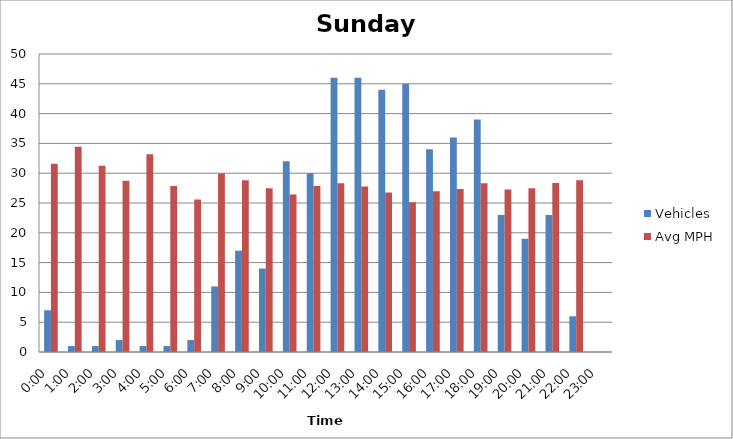
| Category | Vehicles | Avg MPH |
|---|---|---|
| 0:00 | 7 | 31.58 |
| 1:00 | 1 | 34.45 |
| 2:00 | 1 | 31.26 |
| 3:00 | 2 | 28.75 |
| 4:00 | 1 | 33.17 |
| 5:00 | 1 | 27.85 |
| 6:00 | 2 | 25.59 |
| 7:00 | 11 | 29.94 |
| 8:00 | 17 | 28.81 |
| 9:00 | 14 | 27.46 |
| 10:00 | 32 | 26.44 |
| 11:00 | 30 | 27.84 |
| 12:00 | 46 | 28.33 |
| 13:00 | 46 | 27.78 |
| 14:00 | 44 | 26.78 |
| 15:00 | 45 | 25.13 |
| 16:00 | 34 | 26.99 |
| 17:00 | 36 | 27.36 |
| 18:00 | 39 | 28.33 |
| 19:00 | 23 | 27.27 |
| 20:00 | 19 | 27.47 |
| 21:00 | 23 | 28.34 |
| 22:00 | 6 | 28.83 |
| 23:00 | 0 | 0 |